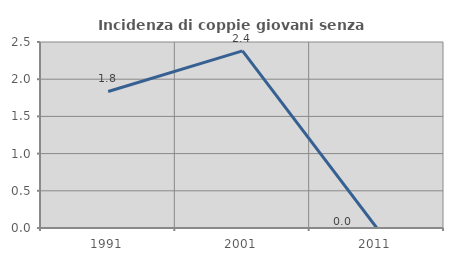
| Category | Incidenza di coppie giovani senza figli |
|---|---|
| 1991.0 | 1.835 |
| 2001.0 | 2.381 |
| 2011.0 | 0 |